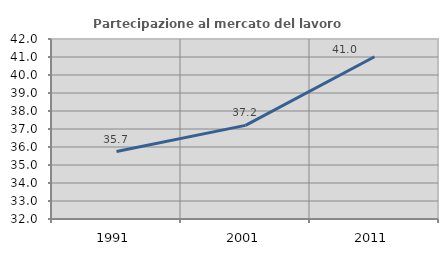
| Category | Partecipazione al mercato del lavoro  femminile |
|---|---|
| 1991.0 | 35.75 |
| 2001.0 | 37.202 |
| 2011.0 | 41.012 |